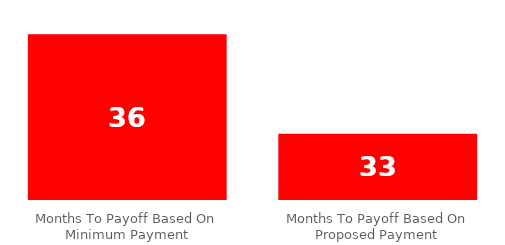
| Category | Series 0 |
|---|---|
| Months To Payoff Based On Minimum Payment | 36 |
| Months To Payoff Based On Proposed Payment | 33 |